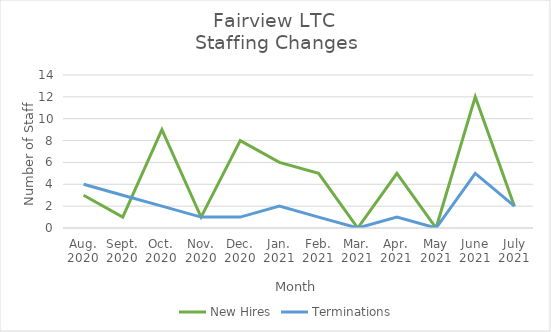
| Category | New Hires | Terminations |
|---|---|---|
| Aug.
2020 | 3 | 4 |
| Sept.
2020 | 1 | 3 |
| Oct.
2020 | 9 | 2 |
| Nov.
2020 | 1 | 1 |
| Dec.
2020 | 8 | 1 |
| Jan.
2021 | 6 | 2 |
| Feb.
2021 | 5 | 1 |
| Mar.
2021 | 0 | 0 |
| Apr.
2021 | 5 | 1 |
| May
2021 | 0 | 0 |
| June
2021 | 12 | 5 |
| July
2021 | 2 | 2 |